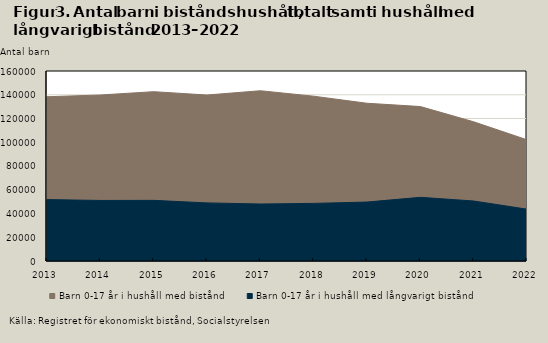
| Category | Barn 0-17 år i hushåll med bistånd  | Barn 0-17 år i hushåll med långvarigt bistånd |
|---|---|---|
| 2013.0 | 138315 | 51715 |
| 2014.0 | 139799 | 50977 |
| 2015.0 | 142592 | 51057 |
| 2016.0 | 139771 | 48933 |
| 2017.0 | 143376 | 47988 |
| 2018.0 | 138787 | 48514 |
| 2019.0 | 132839 | 49644 |
| 2020.0 | 130076 | 53616 |
| 2021.0 | 117227 | 50515 |
| 2022.0 | 102067 | 43626 |